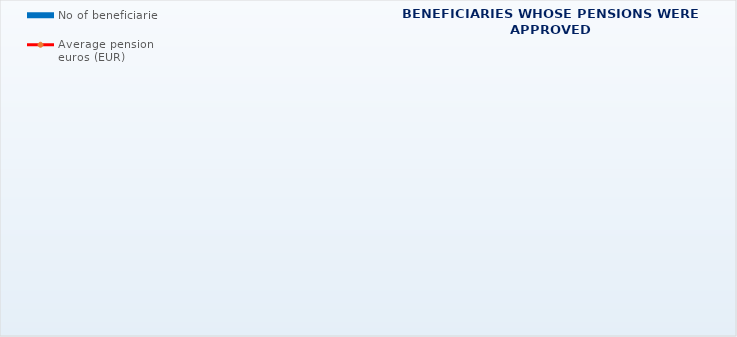
| Category | No of beneficiaries |
|---|---|
| Authorised officials in internal affairs, judicial officers and workers engaged in demining work: | 17183 |
| Pension beneficiaries entitled under the Fire Services Act (Official Gazette 125/19) | 376 |
| Active military personnel - DVO  | 16125 |
| Croatian Homeland Army veterans mobilised from 1941 to 1945 | 1764 |
| Former political prisoners | 2012 |
| Croatian Veterans from the Homeland War - ZOHBDR (Act on Croatian Homeland War Veterans and Their Family Members) | 71299 |
| Pensions approved under general regulations and determined according to the Act on the Rights of Croatian Homeland War Veterans and their Family Members (ZOHBDR), in 2017 (Art. 27, 35, 48 and 49, paragraph 2)    | 58589 |
| Former Yugoslav People's Army members - JNA   | 3504 |
| Former Yugoslav People's Army members - JNA - Art. 185 of Pension Insurance Act (ZOMO)  | 153 |
| National Liberation War veterans - NOR | 4649 |
| Members of the Croatian Parliament, members of the Government, judges of the Constitutional Court and the Auditor General | 679 |
| Members of the Parliamentary Executive Council and administratively retired federal civil servants  (relates to the former SFRY) | 62 |
| Former officials of federal bodies o the former SFRJ -  Article 38 of the Pension Insurance Act (ZOMO) | 17 |
| Full members of the Croatian Academy of Sciences and Arts - HAZU | 119 |
| Miners from the Istrian coal mines "Tupljak" d.d. Labin  | 246 |
| Workers professionally exposed to asbestos | 816 |
| Insurees - crew members on a ship in international and national navigation  - Article  129, paragraph 2 of the Maritime Code | 207 |
| Members of the Croatian Defence Council - HVO  | 6722 |